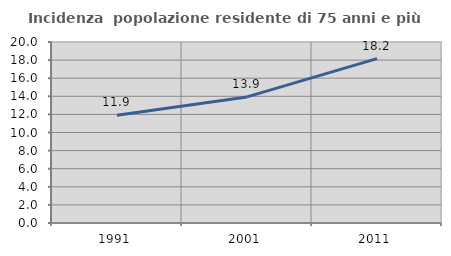
| Category | Incidenza  popolazione residente di 75 anni e più |
|---|---|
| 1991.0 | 11.898 |
| 2001.0 | 13.93 |
| 2011.0 | 18.164 |